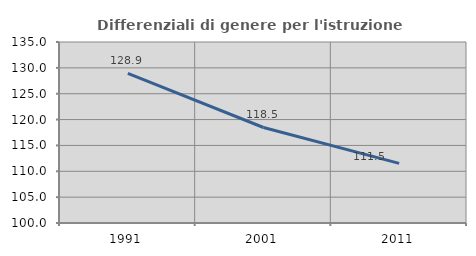
| Category | Differenziali di genere per l'istruzione superiore |
|---|---|
| 1991.0 | 128.915 |
| 2001.0 | 118.47 |
| 2011.0 | 111.527 |